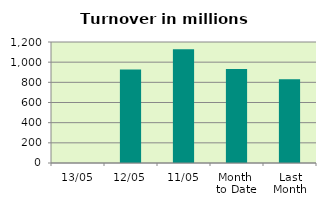
| Category | Series 0 |
|---|---|
| 13/05 | 0 |
| 12/05 | 928.369 |
| 11/05 | 1127.883 |
| Month 
to Date | 932.215 |
| Last
Month | 829.993 |